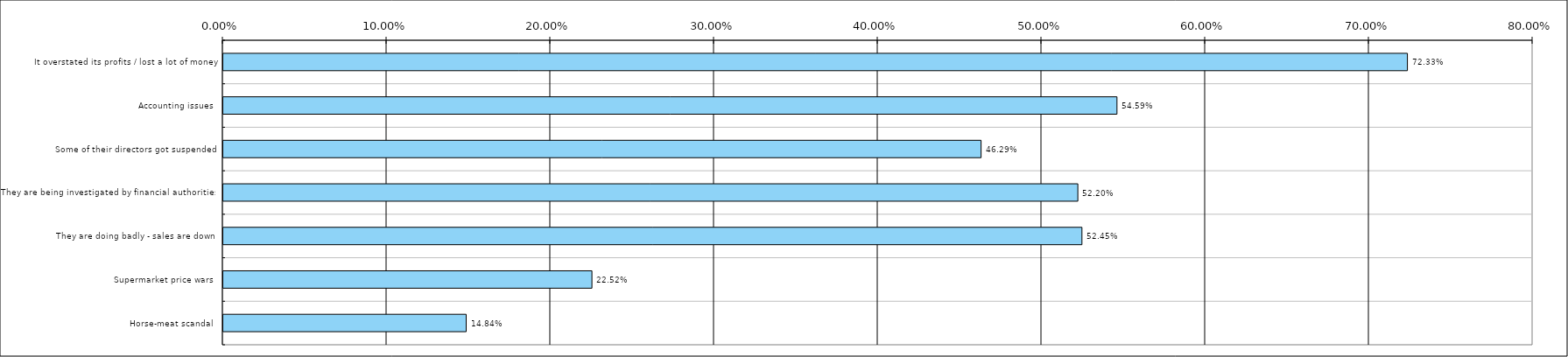
| Category | Total(United Kingdom) |
|---|---|
| It overstated its profits / lost a lot of money | 0.723 |
| Accounting issues | 0.546 |
| Some of their directors got suspended | 0.463 |
| They are being investigated by financial authorities | 0.522 |
| They are doing badly - sales are down | 0.524 |
| Supermarket price wars | 0.225 |
| Horse-meat scandal | 0.148 |